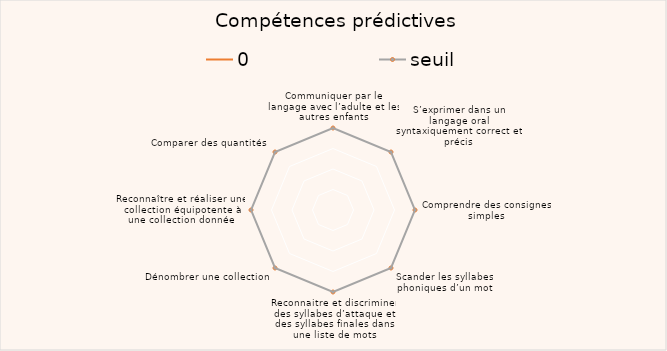
| Category | 0 | seuil |
|---|---|---|
| Communiquer par le langage avec l’adulte et les autres enfants |  | 2 |
| S’exprimer dans un langage oral syntaxiquement correct et précis |  | 2 |
| Comprendre des consignes simples |  | 2 |
| Scander les syllabes phoniques d’un mot |  | 2 |
| Reconnaitre et discriminer des syllabes d’attaque et des syllabes finales dans une liste de mots |  | 2 |
| Dénombrer une collection |  | 2 |
| Reconnaître et réaliser une collection équipotente à une collection donnée |  | 2 |
| Comparer des quantités  |  | 2 |